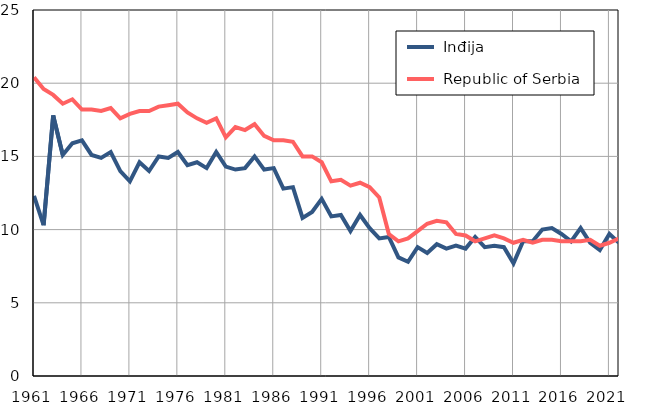
| Category |  Inđija |  Republic of Serbia |
|---|---|---|
| 1961.0 | 12.3 | 20.4 |
| 1962.0 | 10.3 | 19.6 |
| 1963.0 | 17.8 | 19.2 |
| 1964.0 | 15.1 | 18.6 |
| 1965.0 | 15.9 | 18.9 |
| 1966.0 | 16.1 | 18.2 |
| 1967.0 | 15.1 | 18.2 |
| 1968.0 | 14.9 | 18.1 |
| 1969.0 | 15.3 | 18.3 |
| 1970.0 | 14 | 17.6 |
| 1971.0 | 13.3 | 17.9 |
| 1972.0 | 14.6 | 18.1 |
| 1973.0 | 14 | 18.1 |
| 1974.0 | 15 | 18.4 |
| 1975.0 | 14.9 | 18.5 |
| 1976.0 | 15.3 | 18.6 |
| 1977.0 | 14.4 | 18 |
| 1978.0 | 14.6 | 17.6 |
| 1979.0 | 14.2 | 17.3 |
| 1980.0 | 15.3 | 17.6 |
| 1981.0 | 14.3 | 16.3 |
| 1982.0 | 14.1 | 17 |
| 1983.0 | 14.2 | 16.8 |
| 1984.0 | 15 | 17.2 |
| 1985.0 | 14.1 | 16.4 |
| 1986.0 | 14.2 | 16.1 |
| 1987.0 | 12.8 | 16.1 |
| 1988.0 | 12.9 | 16 |
| 1989.0 | 10.8 | 15 |
| 1990.0 | 11.2 | 15 |
| 1991.0 | 12.1 | 14.6 |
| 1992.0 | 10.9 | 13.3 |
| 1993.0 | 11 | 13.4 |
| 1994.0 | 9.9 | 13 |
| 1995.0 | 11 | 13.2 |
| 1996.0 | 10.1 | 12.9 |
| 1997.0 | 9.4 | 12.2 |
| 1998.0 | 9.5 | 9.7 |
| 1999.0 | 8.1 | 9.2 |
| 2000.0 | 7.8 | 9.4 |
| 2001.0 | 8.8 | 9.9 |
| 2002.0 | 8.4 | 10.4 |
| 2003.0 | 9 | 10.6 |
| 2004.0 | 8.7 | 10.5 |
| 2005.0 | 8.9 | 9.7 |
| 2006.0 | 8.7 | 9.6 |
| 2007.0 | 9.5 | 9.2 |
| 2008.0 | 8.8 | 9.4 |
| 2009.0 | 8.9 | 9.6 |
| 2010.0 | 8.8 | 9.4 |
| 2011.0 | 7.7 | 9.1 |
| 2012.0 | 9.2 | 9.3 |
| 2013.0 | 9.2 | 9.1 |
| 2014.0 | 10 | 9.3 |
| 2015.0 | 10.1 | 9.3 |
| 2016.0 | 9.7 | 9.2 |
| 2017.0 | 9.2 | 9.2 |
| 2018.0 | 10.1 | 9.2 |
| 2019.0 | 9.1 | 9.3 |
| 2020.0 | 8.6 | 8.9 |
| 2021.0 | 9.7 | 9.1 |
| 2022.0 | 9.1 | 9.4 |